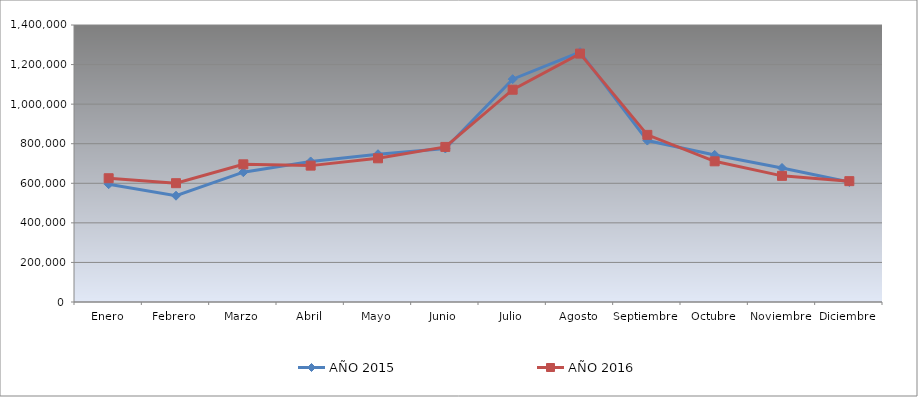
| Category | AÑO 2015 | AÑO 2016 |
|---|---|---|
| Enero | 595440 | 625460 |
| Febrero | 537220 | 600500 |
| Marzo | 656000 | 695860 |
| Abril | 710200 | 689280 |
| Mayo | 746780 | 726220 |
| Junio | 776040 | 783840 |
| Julio | 1126280 | 1072840 |
| Agosto | 1263120 | 1255440 |
| Septiembre | 816000 | 844710 |
| Octubre | 743420 | 710980 |
| Noviembre | 677380 | 637560 |
| Diciembre | 606460 | 610780 |